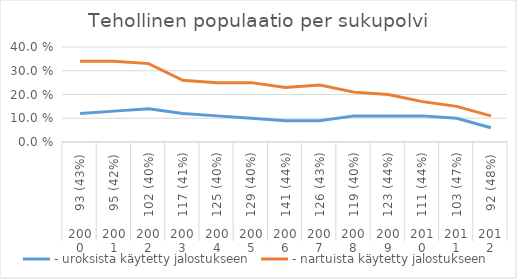
| Category | - uroksista käytetty jalostukseen | - nartuista käytetty jalostukseen |
|---|---|---|
| 0 | 0.12 | 0.34 |
| 1 | 0.13 | 0.34 |
| 2 | 0.14 | 0.33 |
| 3 | 0.12 | 0.26 |
| 4 | 0.11 | 0.25 |
| 5 | 0.1 | 0.25 |
| 6 | 0.09 | 0.23 |
| 7 | 0.09 | 0.24 |
| 8 | 0.11 | 0.21 |
| 9 | 0.11 | 0.2 |
| 10 | 0.11 | 0.17 |
| 11 | 0.1 | 0.15 |
| 12 | 0.06 | 0.11 |